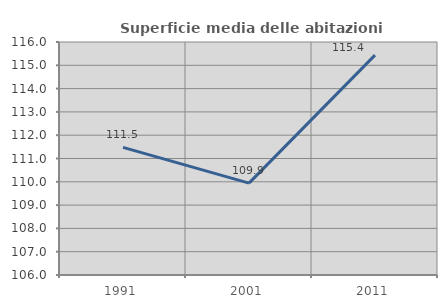
| Category | Superficie media delle abitazioni occupate |
|---|---|
| 1991.0 | 111.479 |
| 2001.0 | 109.944 |
| 2011.0 | 115.438 |